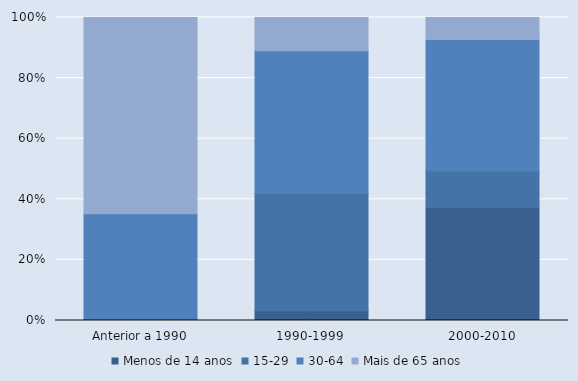
| Category | Menos de 14 anos | 15-29 | 30-64 | Mais de 65 anos |
|---|---|---|---|---|
| Anterior a 1990 | 0 | 0.2 | 35 | 64.8 |
| 1990-1999 | 3.1 | 38.7 | 47.2 | 11 |
| 2000-2010 | 37.2 | 12.1 | 43.4 | 7.3 |